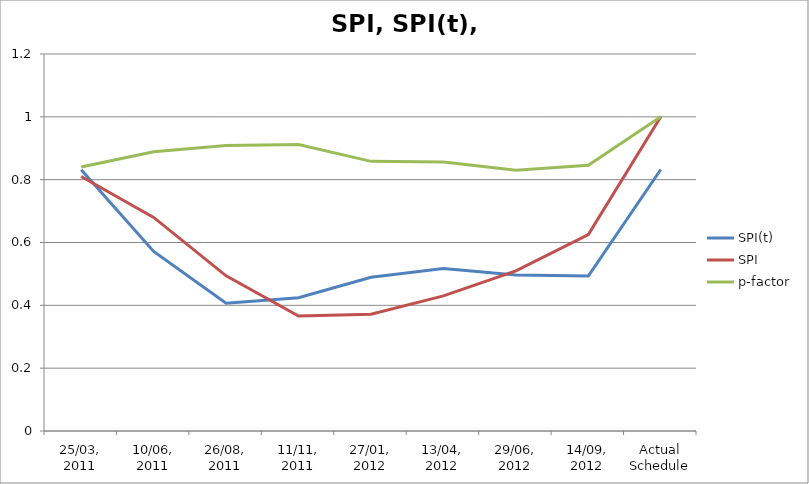
| Category | SPI(t) | SPI | p-factor |
|---|---|---|---|
| 25/03, 2011 | 0.832 | 0.81 | 0.84 |
| 10/06, 2011 | 0.572 | 0.68 | 0.889 |
| 26/08, 2011 | 0.407 | 0.494 | 0.908 |
| 11/11, 2011 | 0.424 | 0.366 | 0.912 |
| 27/01, 2012 | 0.49 | 0.372 | 0.858 |
| 13/04, 2012 | 0.517 | 0.43 | 0.856 |
| 29/06, 2012 | 0.497 | 0.51 | 0.83 |
| 14/09, 2012 | 0.493 | 0.625 | 0.846 |
| Actual Schedule | 0.832 | 1 | 1 |